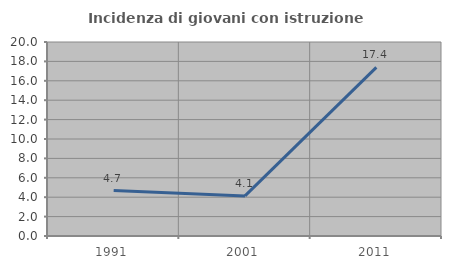
| Category | Incidenza di giovani con istruzione universitaria |
|---|---|
| 1991.0 | 4.688 |
| 2001.0 | 4.132 |
| 2011.0 | 17.391 |